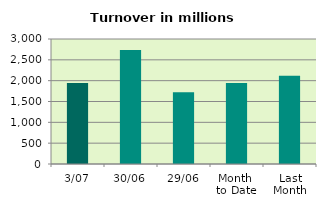
| Category | Series 0 |
|---|---|
| 3/07 | 1941.15 |
| 30/06 | 2733.742 |
| 29/06 | 1722.573 |
| Month 
to Date | 1941.15 |
| Last
Month | 2115.436 |